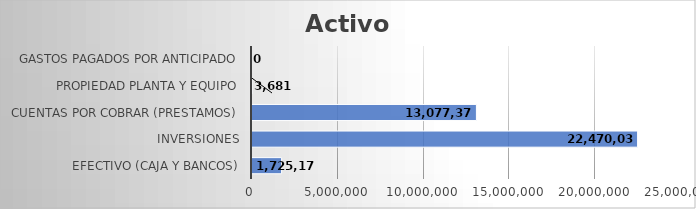
| Category | Valor |
|---|---|
| Efectivo (Caja y Bancos) | 1725176 |
| Inversiones | 22470037 |
| Cuentas por Cobrar (Prestamos) | 13077372 |
| Propiedad planta y equipo | 3681 |
| Gastos pagados por anticipado | 0 |